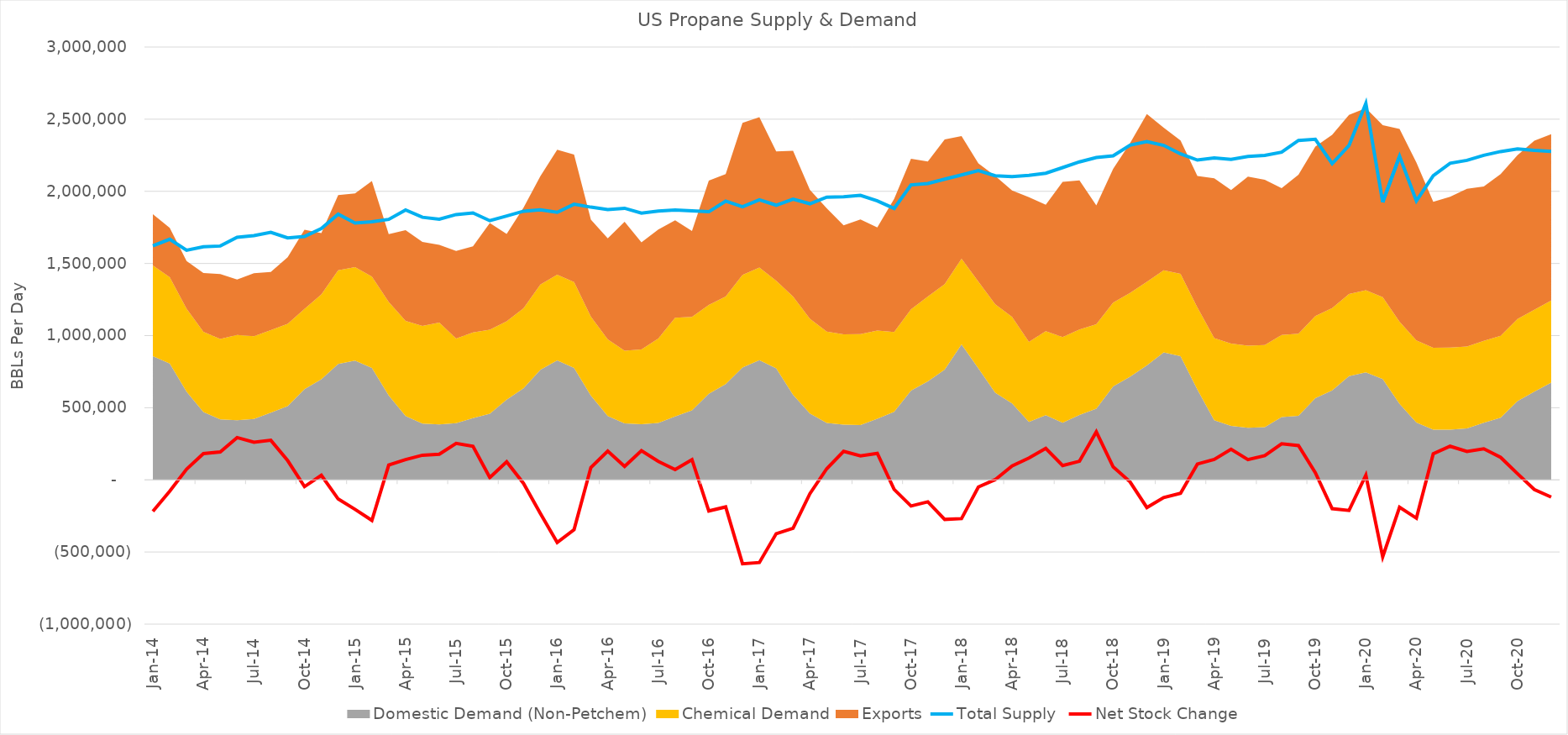
| Category | Total Supply  | Net Stock Change  |
|---|---|---|
| 2014-01-15 | 1622096.774 | -218812.004 |
| 2014-02-15 | 1667821.429 | -78513.781 |
| 2014-03-15 | 1591032.258 | 74364.262 |
| 2014-04-15 | 1615666.667 | 182207.802 |
| 2014-05-15 | 1620741.935 | 193736.502 |
| 2014-06-15 | 1681100 | 293050.86 |
| 2014-07-15 | 1692967.742 | 261088.504 |
| 2014-08-15 | 1716129.032 | 274528.162 |
| 2014-09-15 | 1677000 | 133607.39 |
| 2014-10-15 | 1686709.677 | -46792.743 |
| 2014-11-15 | 1742100 | 31982.998 |
| 2014-12-15 | 1841806.452 | -132653.105 |
| 2015-01-15 | 1780129.032 | -204661.372 |
| 2015-02-15 | 1789500 | -281201.886 |
| 2015-03-15 | 1805612.903 | 102788.25 |
| 2015-04-15 | 1870600 | 140352.809 |
| 2015-05-15 | 1820290.323 | 170704.641 |
| 2015-06-15 | 1806333.333 | 177689.058 |
| 2015-07-15 | 1838838.71 | 252485.588 |
| 2015-08-15 | 1850225.806 | 232166.674 |
| 2015-09-15 | 1796500 | 16077.309 |
| 2015-10-15 | 1829354.839 | 125142.748 |
| 2015-11-15 | 1862033.333 | -24429.85 |
| 2015-12-15 | 1871193.548 | -233155.946 |
| 2016-01-15 | 1854225.806 | -433807.116 |
| 2016-02-15 | 1910482.759 | -344954.67 |
| 2016-03-15 | 1890225.806 | 86050.25 |
| 2016-04-15 | 1873600 | 198952.211 |
| 2016-05-15 | 1882548.387 | 93436.076 |
| 2016-06-15 | 1848600 | 202097.179 |
| 2016-07-15 | 1862903.226 | 128000.653 |
| 2016-08-15 | 1870387.097 | 71346.679 |
| 2016-09-15 | 1864706.768 | 140225.543 |
| 2016-10-15 | 1858399.241 | -215469.31 |
| 2016-11-15 | 1931774.435 | -187649.831 |
| 2016-12-15 | 1892723.822 | -581602.206 |
| 2017-01-15 | 1940660.306 | -573193.799 |
| 2017-02-15 | 1903811.882 | -373222.104 |
| 2017-03-15 | 1945275.209 | -334968.793 |
| 2017-04-15 | 1913879.435 | -95813.261 |
| 2017-05-15 | 1959309.467 | 77208.867 |
| 2017-06-15 | 1962100 | 197463.175 |
| 2017-07-15 | 1971967.742 | 166694.729 |
| 2017-08-15 | 1933510.444 | 183314.166 |
| 2017-09-15 | 1881212.027 | -66547.321 |
| 2017-10-15 | 2044613.619 | -181194.289 |
| 2017-11-15 | 2054398.489 | -152314.362 |
| 2017-12-15 | 2084671.157 | -274333.4 |
| 2018-01-15 | 2113450.393 | -268758.608 |
| 2018-02-15 | 2143647.86 | -49639.725 |
| 2018-03-15 | 2108130.29 | 1712.803 |
| 2018-04-15 | 2101524.814 | 96421.608 |
| 2018-05-15 | 2110293.223 | 151703.929 |
| 2018-06-15 | 2125167.44 | 217850.972 |
| 2018-07-15 | 2164567.713 | 99130.761 |
| 2018-08-15 | 2203928.897 | 128939.214 |
| 2018-09-15 | 2234354.001 | 332504.369 |
| 2018-10-15 | 2246171.603 | 90221.547 |
| 2018-11-15 | 2319715.176 | -13701.306 |
| 2018-12-15 | 2344218.297 | -191915.327 |
| 2019-01-15 | 2318317.083 | -122504.961 |
| 2019-02-15 | 2259581.503 | -93176.86 |
| 2019-03-15 | 2216760.238 | 109840.337 |
| 2019-04-15 | 2231633.957 | 141391.928 |
| 2019-05-15 | 2221181.755 | 211980.343 |
| 2019-06-15 | 2241579.876 | 140112.921 |
| 2019-07-15 | 2248656.894 | 168353.503 |
| 2019-08-15 | 2271129.729 | 249706.075 |
| 2019-09-15 | 2352659.841 | 237907.813 |
| 2019-10-15 | 2360246.456 | 50171.903 |
| 2019-11-15 | 2192136.179 | -200035.022 |
| 2019-12-15 | 2317559.536 | -212379.812 |
| 2020-01-15 | 2609069.9 | 32087.635 |
| 2020-02-15 | 1924419.929 | -533448.857 |
| 2020-03-15 | 2242835.635 | -189964.436 |
| 2020-04-15 | 1933858.508 | -265474.772 |
| 2020-05-15 | 2108663.505 | 180841.061 |
| 2020-06-15 | 2194402.695 | 232936.181 |
| 2020-07-15 | 2214819.33 | 197366.555 |
| 2020-08-15 | 2249789.972 | 215598.281 |
| 2020-09-15 | 2275583.285 | 155777.221 |
| 2020-10-15 | 2293419.646 | 42635.139 |
| 2020-11-15 | 2283584.358 | -66913.874 |
| 2020-12-15 | 2277028.848 | -119125.994 |